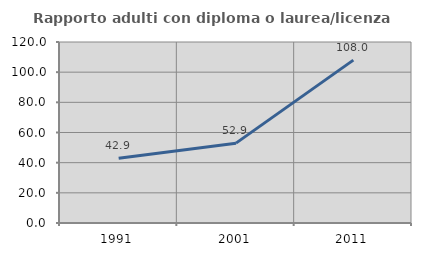
| Category | Rapporto adulti con diploma o laurea/licenza media  |
|---|---|
| 1991.0 | 42.857 |
| 2001.0 | 52.941 |
| 2011.0 | 108 |